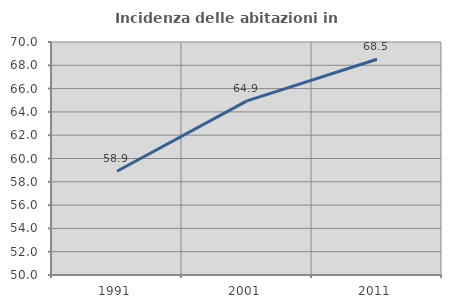
| Category | Incidenza delle abitazioni in proprietà  |
|---|---|
| 1991.0 | 58.903 |
| 2001.0 | 64.948 |
| 2011.0 | 68.523 |